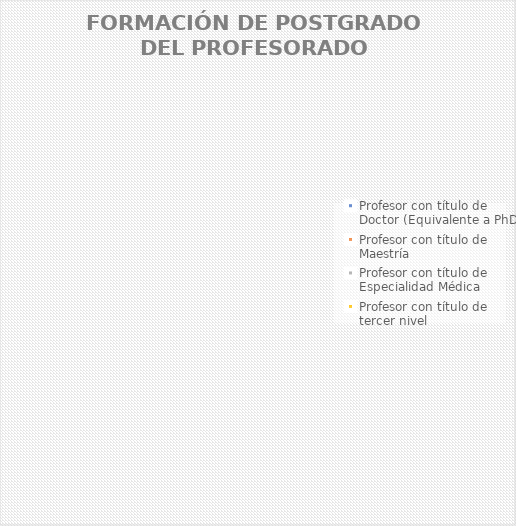
| Category | Series 0 |
|---|---|
| Profesor con título de Doctor (Equivalente a PhD) | 0 |
| Profesor con título de Maestría | 0 |
| Profesor con título de Especialidad Médica | 0 |
| Profesor con título de tercer nivel | 0 |